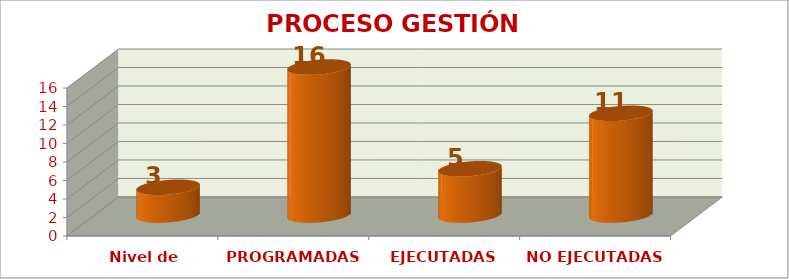
| Category | GESTIÓN ESTRATÉGICA |
|---|---|
| Nivel de satisfacción | 3 |
| PROGRAMADAS | 16 |
| EJECUTADAS | 5 |
| NO EJECUTADAS | 11 |